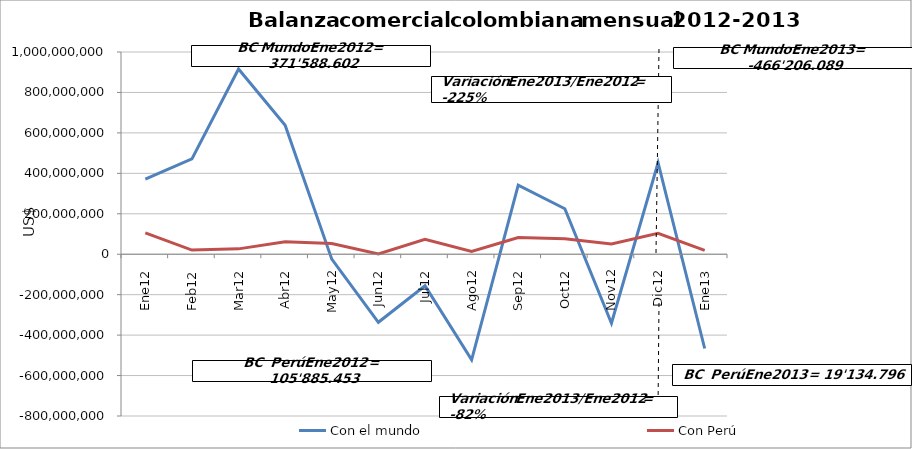
| Category | Con el mundo | Con Perú |
|---|---|---|
| 0 | 371588601.84 | 105885452.56 |
| 1 | 471109607.31 | 20340459.86 |
| 2 | 915911670.59 | 26480262.78 |
| 3 | 637706812.67 | 61829556.47 |
| 4 | -24278377.48 | 53331783.05 |
| 5 | -336582158.92 | 1259307.65 |
| 6 | -156141093.75 | 74188770.47 |
| 7 | -522487753.65 | 13731255.99 |
| 8 | 341551791.65 | 82897800.7 |
| 9 | 224887257.5 | 76350648.79 |
| 10 | -341510254.09 | 50659847.68 |
| 11 | 452349103.5 | 103178903.25 |
| 12 | -466206089.24 | 19134795.77 |